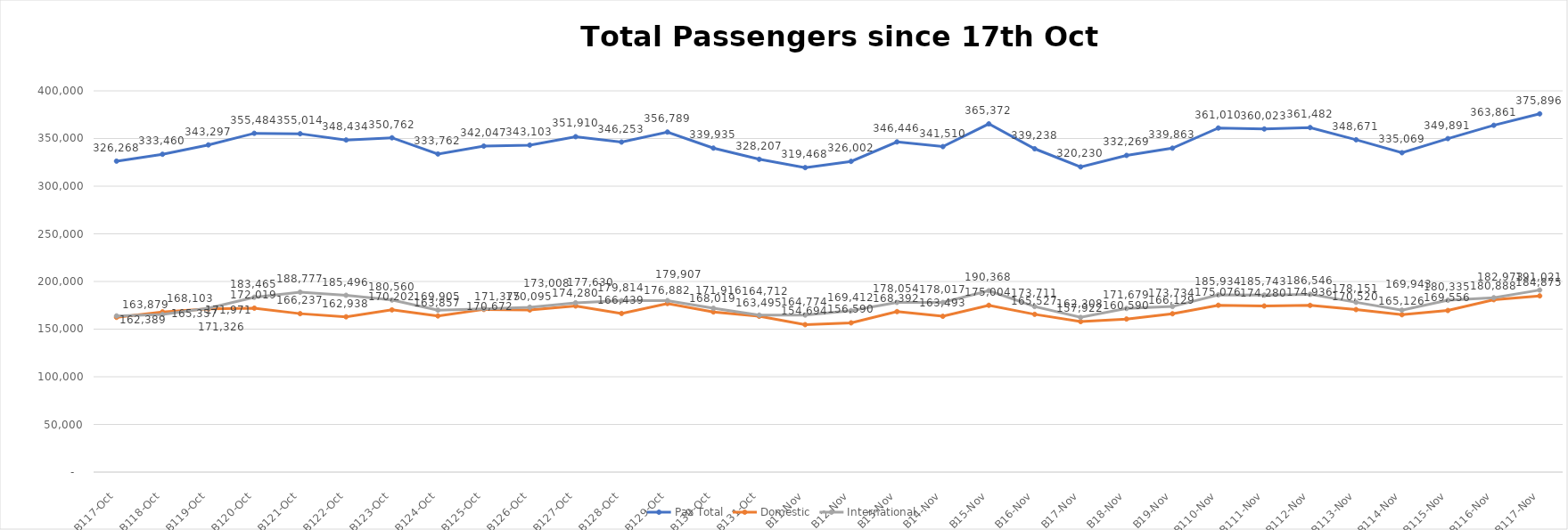
| Category | Pax Total | Domestic | International |
|---|---|---|---|
| 2023-10-17 | 326268 | 162389 | 163879 |
| 2023-10-18 | 333460 | 168103 | 165357 |
| 2023-10-19 | 343297 | 171326 | 171971 |
| 2023-10-20 | 355484 | 172019 | 183465 |
| 2023-10-21 | 355014 | 166237 | 188777 |
| 2023-10-22 | 348434 | 162938 | 185496 |
| 2023-10-23 | 350762 | 170202 | 180560 |
| 2023-10-24 | 333762 | 163857 | 169905 |
| 2023-10-25 | 342047 | 170672 | 171375 |
| 2023-10-26 | 343103 | 170095 | 173008 |
| 2023-10-27 | 351910 | 174280 | 177630 |
| 2023-10-28 | 346253 | 166439 | 179814 |
| 2023-10-29 | 356789 | 176882 | 179907 |
| 2023-10-30 | 339935 | 168019 | 171916 |
| 2023-10-31 | 328207 | 163495 | 164712 |
| 2023-11-01 | 319468 | 154694 | 164774 |
| 2023-11-02 | 326002 | 156590 | 169412 |
| 2023-11-03 | 346446 | 168392 | 178054 |
| 2023-11-04 | 341510 | 163493 | 178017 |
| 2023-11-05 | 365372 | 175004 | 190368 |
| 2023-11-06 | 339238 | 165527 | 173711 |
| 2023-11-07 | 320230 | 157922 | 162308 |
| 2023-11-08 | 332269 | 160590 | 171679 |
| 2023-11-09 | 339863 | 166129 | 173734 |
| 2023-11-10 | 361010 | 175076 | 185934 |
| 2023-11-11 | 360023 | 174280 | 185743 |
| 2023-11-12 | 361482 | 174936 | 186546 |
| 2023-11-13 | 348671 | 170520 | 178151 |
| 2023-11-14 | 335069 | 165126 | 169943 |
| 2023-11-15 | 349891 | 169556 | 180335 |
| 2023-11-16 | 363861 | 180888 | 182973 |
| 2023-11-17 | 375896 | 184875 | 191021 |